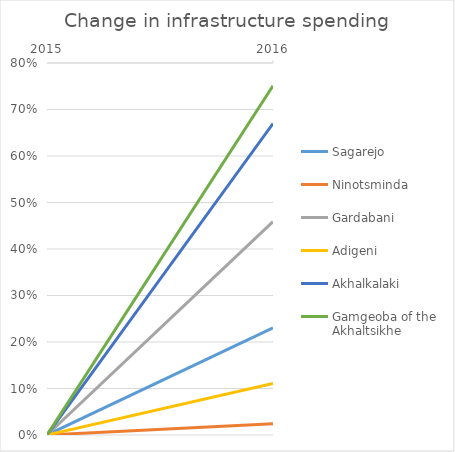
| Category | Sagarejo | Ninotsminda  | Gardabani  | Adigeni  | Akhalkalaki  | Gamgeoba of the Akhaltsikhe  |
|---|---|---|---|---|---|---|
| 2015.0 | 0 | 0 | 0 | 0 | 0 | 0 |
| 2016.0 | 0.23 | 0.024 | 0.459 | 0.111 | 0.67 | 0.751 |